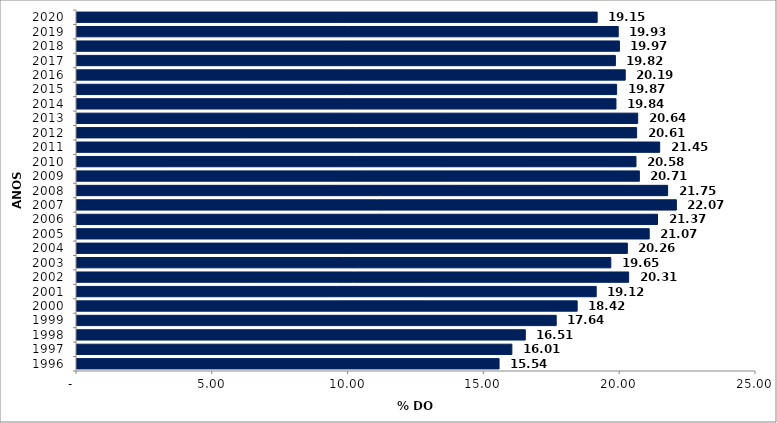
| Category | Series 0 |
|---|---|
| 1996 | 15.54 |
| 1997 | 16.011 |
| 1998 | 16.505 |
| 1999 | 17.644 |
| 2000 | 18.415 |
| 2001 | 19.117 |
| 2002 | 20.311 |
| 2003 | 19.654 |
| 2004 | 20.264 |
| 2005 | 21.068 |
| 2006 | 21.374 |
| 2007 | 22.069 |
| 2008 | 21.746 |
| 2009 | 20.706 |
| 2010 | 20.581 |
| 2011 | 21.454 |
| 2012 | 20.605 |
| 2013 | 20.644 |
| 2014 | 19.844 |
| 2015 | 19.868 |
| 2016 | 20.186 |
| 2017 | 19.823 |
| 2018 | 19.972 |
| 2019 | 19.928 |
| 2020 | 19.152 |